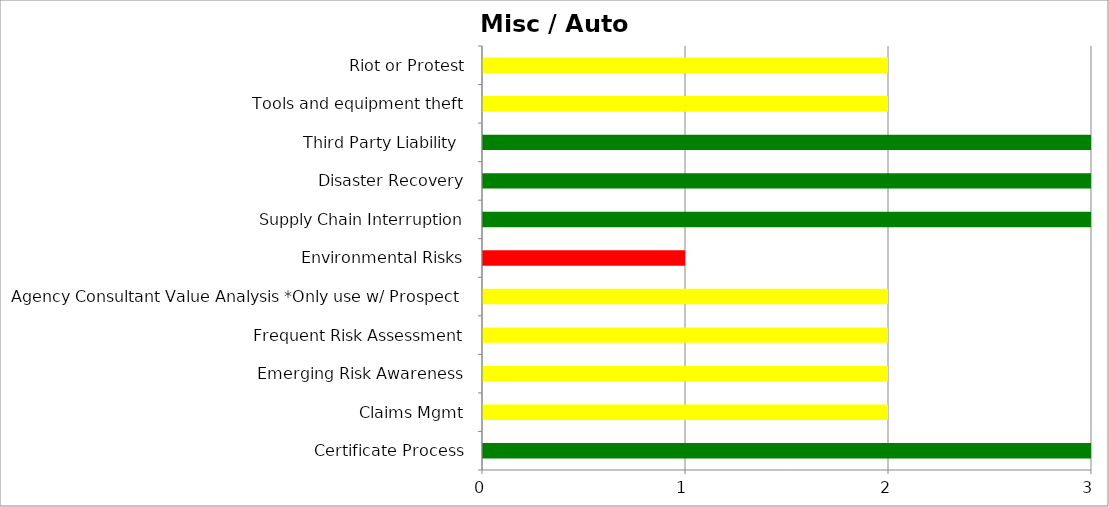
| Category | Series 0 | Series 1 | Series 2 |
|---|---|---|---|
| Certificate Process | 3 | 0 | 0 |
| Claims Mgmt | 0 | 2 | 0 |
| Emerging Risk Awareness | 0 | 2 | 0 |
| Frequent Risk Assessment | 0 | 2 | 0 |
| Agency Consultant Value Analysis *Only use w/ Prospect | 0 | 2 | 0 |
|  Environmental Risks | 0 | 0 | 1 |
| Supply Chain Interruption | 3 | 0 | 0 |
| Disaster Recovery | 3 | 0 | 0 |
| Third Party Liability  | 3 | 0 | 0 |
| Tools and equipment theft | 0 | 2 | 0 |
| Riot or Protest | 0 | 2 | 0 |